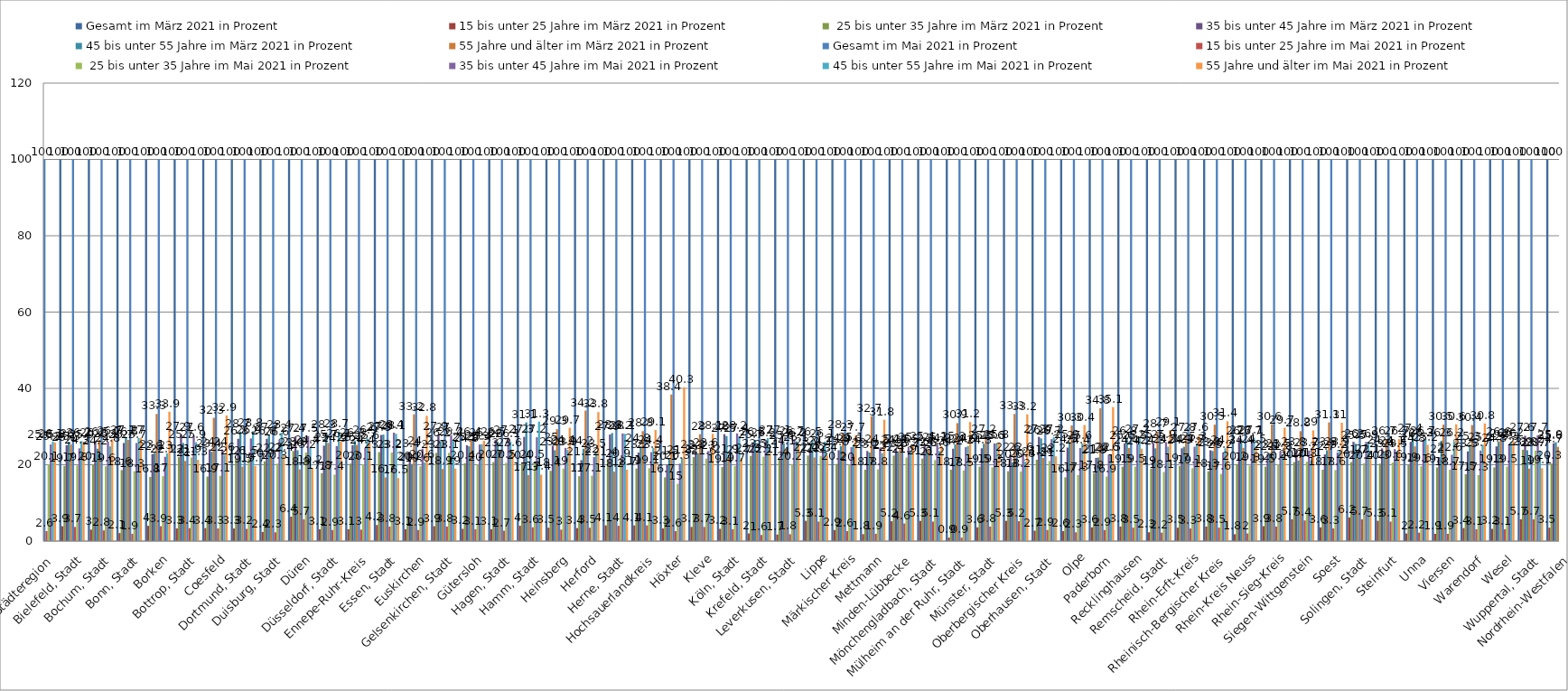
| Category | Gesamt im März 2021 in Prozent | 15 bis unter 25 Jahre im März 2021 in Prozent |  25 bis unter 35 Jahre im März 2021 in Prozent | 35 bis unter 45 Jahre im März 2021 in Prozent | 45 bis unter 55 Jahre im März 2021 in Prozent | 55 Jahre und älter im März 2021 in Prozent | Gesamt im Mai 2021 in Prozent | 15 bis unter 25 Jahre im Mai 2021 in Prozent |  25 bis unter 35 Jahre im Mai 2021 in Prozent | 35 bis unter 45 Jahre im Mai 2021 in Prozent | 45 bis unter 55 Jahre im Mai 2021 in Prozent | 55 Jahre und älter im Mai 2021 in Prozent |
|---|---|---|---|---|---|---|---|---|---|---|---|---|
| Aachen, Städteregion | 100 | 2.7 | 20.3 | 25.2 | 26.1 | 25.8 | 100 | 2.6 | 20.1 | 25.3 | 26.1 | 25.8 |
| Bielefeld, Stadt | 100 | 3.9 | 19.7 | 25.1 | 26 | 25.3 | 100 | 3.7 | 19.8 | 24.3 | 26.2 | 25.9 |
| Bochum, Stadt | 100 | 3 | 20.1 | 26.2 | 24.2 | 26.5 | 100 | 2.8 | 19.6 | 26.1 | 24.8 | 26.7 |
| Bonn, Stadt | 100 | 2.1 | 18.6 | 25.7 | 27.1 | 26.5 | 100 | 1.9 | 18.3 | 25.7 | 27 | 27 |
| Borken | 100 | 4 | 16.8 | 22.8 | 23.1 | 33.3 | 100 | 3.9 | 17 | 22.1 | 23 | 33.9 |
| Bottrop, Stadt | 100 | 3.3 | 22 | 27.9 | 25.7 | 21 | 100 | 3.4 | 21.9 | 27.6 | 25.9 | 21.3 |
| Coesfeld | 100 | 3.4 | 16.9 | 24 | 23.4 | 32.3 | 100 | 3.3 | 17.1 | 24 | 22.6 | 32.9 |
| Dortmund, Stadt | 100 | 3.3 | 21.6 | 26.8 | 28.7 | 19.5 | 100 | 3.2 | 21.5 | 26.9 | 28.8 | 19.7 |
| Duisburg, Stadt | 100 | 2.4 | 20.9 | 26.8 | 27.7 | 22.2 | 100 | 2.3 | 20.3 | 26.6 | 28.4 | 22.4 |
| Düren | 100 | 6.4 | 23.6 | 27.4 | 23.8 | 18.8 | 100 | 5.7 | 23.2 | 27.5 | 24.4 | 19.2 |
| Düsseldorf, Stadt | 100 | 3.1 | 17.8 | 25 | 28.3 | 25.7 | 100 | 2.9 | 17.4 | 24.9 | 28.7 | 26.1 |
| Ennepe-Ruhr-Kreis | 100 | 3.1 | 20.3 | 25.1 | 26.3 | 25.2 | 100 | 3 | 20.1 | 24.4 | 26.9 | 25.6 |
| Essen, Stadt | 100 | 4.2 | 23.3 | 27.8 | 27.9 | 16.7 | 100 | 3.8 | 23.2 | 28.4 | 28.1 | 16.5 |
| Euskirchen | 100 | 3.1 | 20 | 23.4 | 20.2 | 33.2 | 100 | 2.9 | 19.6 | 24.2 | 20.6 | 32.8 |
| Gelsenkirchen, Stadt | 100 | 3.9 | 23.1 | 27.9 | 26.2 | 18.9 | 100 | 3.8 | 23.1 | 27.7 | 26.4 | 19 |
| Gütersloh | 100 | 3.2 | 20.4 | 25.1 | 24.8 | 26.4 | 100 | 3.1 | 20 | 25.3 | 25.4 | 26.3 |
| Hagen, Stadt | 100 | 3.1 | 20.7 | 26.5 | 26 | 23.7 | 100 | 2.7 | 20.5 | 27.1 | 26.1 | 23.6 |
| Hamm, Stadt | 100 | 4 | 20.4 | 27.3 | 31.1 | 17.3 | 100 | 3.6 | 20.5 | 27.2 | 31.3 | 17.4 |
| Heinsberg | 100 | 3.5 | 18.4 | 25 | 23.8 | 29.3 | 100 | 3 | 19 | 24.4 | 23.9 | 29.7 |
| Herford | 100 | 3.4 | 17 | 21.2 | 24.2 | 34.2 | 100 | 3.5 | 17.1 | 22 | 23.5 | 33.8 |
| Herne, Stadt | 100 | 4.1 | 21.4 | 27.9 | 28.3 | 18.2 | 100 | 4 | 20.9 | 28.2 | 28.1 | 18.7 |
| Hochsauerlandkreis | 100 | 4.1 | 19 | 23.2 | 24.8 | 28.8 | 100 | 4.1 | 19.1 | 23.3 | 24.4 | 29.1 |
| Höxter | 100 | 3.3 | 16.7 | 20.1 | 21.5 | 38.4 | 100 | 2.6 | 15 | 20.3 | 21.8 | 40.3 |
| Kleve | 100 | 3.7 | 22 | 23.3 | 23 | 28 | 100 | 3.7 | 21.6 | 23.6 | 23 | 28.1 |
| Köln, Stadt | 100 | 3.2 | 19.4 | 28 | 27.5 | 21.9 | 100 | 3.1 | 19.7 | 28.2 | 27.4 | 21.7 |
| Krefeld, Stadt | 100 | 2 | 22.3 | 25.7 | 26.5 | 23.5 | 100 | 1.6 | 22.1 | 26.2 | 27 | 23.1 |
| Leverkusen, Stadt | 100 | 1.7 | 21.4 | 27.1 | 25.6 | 24.1 | 100 | 1.8 | 20.2 | 26.7 | 26.2 | 25.1 |
| Lippe | 100 | 5.3 | 22.4 | 23.9 | 26.5 | 21.9 | 100 | 5.1 | 22.3 | 24.1 | 26.1 | 22.4 |
| Märkischer Kreis | 100 | 2.9 | 20.2 | 23.8 | 24.9 | 28.3 | 100 | 2.6 | 20 | 24.6 | 25.1 | 27.7 |
| Mettmann | 100 | 1.8 | 18.7 | 23.6 | 23.2 | 32.7 | 100 | 1.9 | 18.8 | 24.5 | 23 | 31.8 |
| Minden-Lübbecke | 100 | 5.2 | 22.4 | 24.3 | 23.5 | 24.5 | 100 | 4.6 | 21.9 | 24.5 | 23.7 | 25.2 |
| Mönchengladbach, Stadt | 100 | 5.3 | 21.6 | 25.4 | 23.6 | 24 | 100 | 5.1 | 21.2 | 25.1 | 23.6 | 24.9 |
| Mülheim an der Ruhr, Stadt | 100 | 0.9 | 18.7 | 24.2 | 25.3 | 30.9 | 100 | 0.9 | 18.5 | 24.6 | 24.9 | 31.2 |
| Münster, Stadt | 100 | 3.6 | 19.5 | 24.3 | 25.5 | 27.2 | 100 | 3.8 | 19.3 | 25.6 | 25.5 | 25.8 |
| Oberbergischer Kreis | 100 | 5.3 | 18.3 | 22.6 | 20.6 | 33.3 | 100 | 5.2 | 18.2 | 22.6 | 20.8 | 33.2 |
| Oberhausen, Stadt | 100 | 2.7 | 21.3 | 27.3 | 26.9 | 21.8 | 100 | 2.9 | 21 | 26.7 | 27.2 | 22.2 |
| Olpe | 100 | 2.6 | 16.7 | 24.5 | 25.9 | 30.3 | 100 | 2.3 | 17.3 | 24.4 | 25.6 | 30.4 |
| Paderborn | 100 | 3.6 | 17.8 | 21.8 | 21.9 | 34.8 | 100 | 2.9 | 16.9 | 22.6 | 22.5 | 35.1 |
| Recklinghausen | 100 | 3.8 | 19.5 | 25.6 | 26.8 | 24.4 | 100 | 3.5 | 19.5 | 25.5 | 27.2 | 24.2 |
| Remscheid, Stadt | 100 | 2.3 | 19 | 25.7 | 24.3 | 28.7 | 100 | 2.2 | 18.1 | 25.9 | 24.7 | 29.1 |
| Rhein-Erft-Kreis | 100 | 3.5 | 19.7 | 24.3 | 24.7 | 27.8 | 100 | 3.3 | 19.1 | 24.7 | 25.3 | 27.6 |
| Rheinisch-Bergischer Kreis | 100 | 3.8 | 18.3 | 23.8 | 23.6 | 30.5 | 100 | 3.5 | 17.6 | 23.2 | 24.3 | 31.4 |
| Rhein-Kreis Neuss | 100 | 1.8 | 20.2 | 27 | 26.7 | 24.4 | 100 | 2 | 19.8 | 26.7 | 27.1 | 24.5 |
| Rhein-Sieg-Kreis | 100 | 3.9 | 19.5 | 22.8 | 23.1 | 30.6 | 100 | 3.8 | 20.1 | 23.5 | 22.8 | 29.7 |
| Siegen-Wittgenstein | 100 | 5.7 | 20.7 | 23.8 | 21.1 | 28.8 | 100 | 5.4 | 20.8 | 23.7 | 21.1 | 29 |
| Soest | 100 | 3.6 | 18.7 | 22.7 | 23.8 | 31.1 | 100 | 3.3 | 18.6 | 23.2 | 23.9 | 31 |
| Solingen, Stadt | 100 | 6.2 | 20.7 | 26 | 25.5 | 21.7 | 100 | 5.7 | 20.4 | 26 | 25.9 | 22.1 |
| Steinfurt | 100 | 5.3 | 20.3 | 24.3 | 23.4 | 26.7 | 100 | 5.1 | 20.6 | 24.1 | 23.5 | 26.7 |
| Unna | 100 | 2 | 19.9 | 26 | 27.4 | 24.8 | 100 | 2.2 | 19.6 | 26.3 | 26.7 | 25.2 |
| Viersen | 100 | 1.9 | 19.3 | 22 | 26.3 | 30.5 | 100 | 1.9 | 18.7 | 22.6 | 26.2 | 30.6 |
| Warendorf | 100 | 3.4 | 17.5 | 23.5 | 25.3 | 30.4 | 100 | 3.1 | 17.3 | 23.7 | 25.2 | 30.8 |
| Wesel | 100 | 3.2 | 19.3 | 24.8 | 26 | 26.6 | 100 | 3.1 | 19.5 | 25.3 | 26 | 26.2 |
| Wuppertal, Stadt | 100 | 5.7 | 23.9 | 27.6 | 23.8 | 19 | 100 | 5.7 | 23.7 | 27.7 | 23.7 | 19.1 |
| Nordrhein-Westfalen | 100 | 3.5 | 20.3 | 25.6 | 25.9 | 24.7 | 100 | 3.3 | 20.2 | 25.7 | 26 | 24.8 |